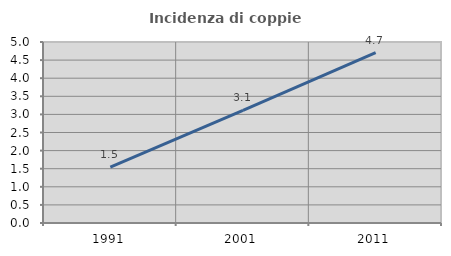
| Category | Incidenza di coppie miste |
|---|---|
| 1991.0 | 1.546 |
| 2001.0 | 3.109 |
| 2011.0 | 4.706 |